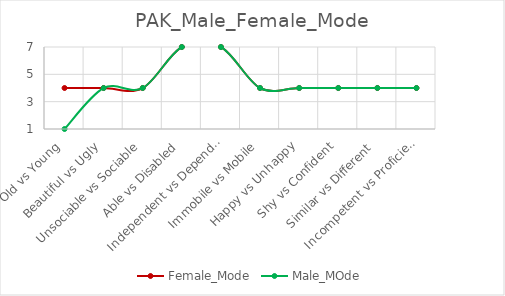
| Category | Female_Mode | Male_MOde |
|---|---|---|
| Old vs Young | 4 | 1 |
|  Beautiful vs Ugly | 4 | 4 |
| Unsociable vs Sociable | 4 | 4 |
| Able vs Disabled | 7 | 7 |
| Independent vs Dependent | 7 | 7 |
| Immobile vs Mobile | 4 | 4 |
| Happy vs Unhappy | 4 | 4 |
| Shy vs Confident | 4 | 4 |
| Similar vs Different | 4 | 4 |
| Incompetent vs Proficient | 4 | 4 |